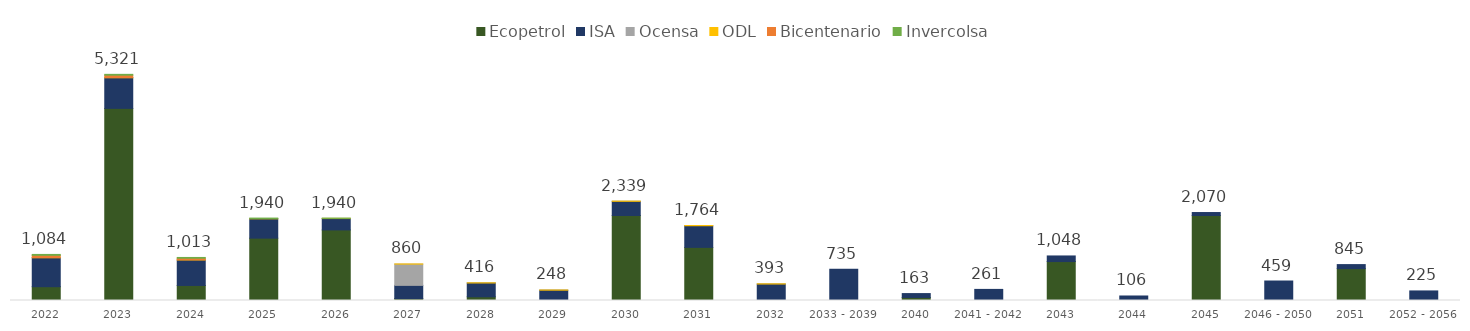
| Category | Ecopetrol | ISA | Ocensa | ODL | Bicentenario | Invercolsa |
|---|---|---|---|---|---|---|
| 2022 | 324.533 | 681.412 | 0 | 3.069 | 54.463 | 20.473 |
| 2023 | 4520.324 | 721.004 | 0 | 3.284 | 57.1 | 19.463 |
| 2024 | 353.823 | 600.224 | 0 | 3.514 | 37.276 | 18.003 |
| 2025 | 1467.229 | 455.113 | 0 | 3.761 | 0 | 13.411 |
| 2026 | 1660.47 | 267.358 | 0 | 4.024 | 0 | 7.886 |
| 2027 | 45.849 | 310.111 | 500 | 4.306 | 0 | 0 |
| 2028 | 87.286 | 324.408 | 0 | 4.608 | 0 | 0 |
| 2029 | 0 | 242.592 | 0 | 4.931 | 0 | 0 |
| 2030 | 2000 | 333.365 | 0 | 5.277 | 0 | 0 |
| 2031 | 1250 | 508.719 | 0 | 5.647 | 0 | 0 |
| 2032 | 0 | 387.336 | 0 | 5.523 | 0 | 0 |
| 2033 - 2039 | 0 | 735.057 | 0 | 0 | 0 | 0 |
| 2040 | 71.411 | 91.48 | 0 | 0 | 0 | 0 |
| 2041 - 2042 | 0 | 261.199 | 0 | 0 | 0 | 0 |
| 2043 | 916.049 | 132.239 | 0 | 0 | 0 | 0 |
| 2044 | 0 | 106.16 | 0 | 0 | 0 | 0 |
| 2045 | 2000 | 69.932 | 0 | 0 | 0 | 0 |
| 2046 - 2050 | 0 | 458.531 | 0 | 0 | 0 | 0 |
| 2051 | 750 | 94.883 | 0 | 0 | 0 | 0 |
| 2052 - 2056 | 0 | 225.207 | 0 | 0 | 0 | 0 |